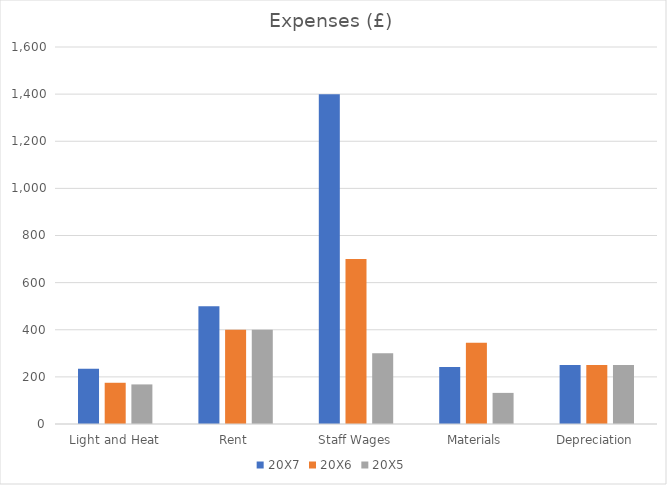
| Category | 20X7 | 20X6 | 20X5 |
|---|---|---|---|
| Light and Heat | 234 | 175 | 168 |
| Rent | 500 | 400 | 400 |
| Staff Wages | 1400 | 700 | 300 |
| Materials | 242 | 345 | 132 |
| Depreciation | 250 | 250 | 250 |